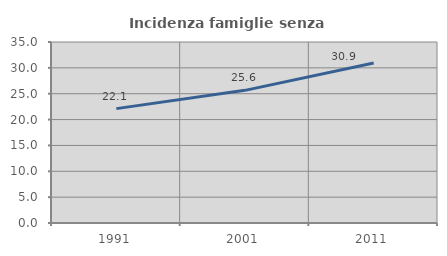
| Category | Incidenza famiglie senza nuclei |
|---|---|
| 1991.0 | 22.118 |
| 2001.0 | 25.649 |
| 2011.0 | 30.931 |